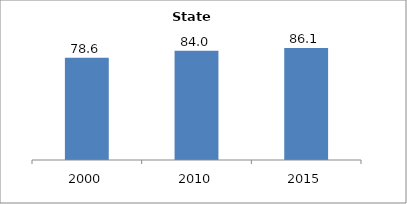
| Category | Series 0 |
|---|---|
| 2000.0 | 78.57 |
| 2010.0 | 84.022 |
| 2015.0 | 86.149 |